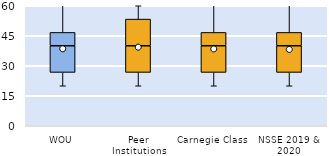
| Category | 25th | 50th | 75th |
|---|---|---|---|
| WOU | 26.667 | 13.333 | 6.667 |
| Peer Institutions | 26.667 | 13.333 | 13.333 |
| Carnegie Class | 26.667 | 13.333 | 6.667 |
| NSSE 2019 & 2020 | 26.667 | 13.333 | 6.667 |